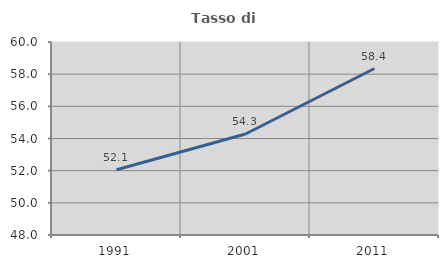
| Category | Tasso di occupazione   |
|---|---|
| 1991.0 | 52.055 |
| 2001.0 | 54.282 |
| 2011.0 | 58.352 |